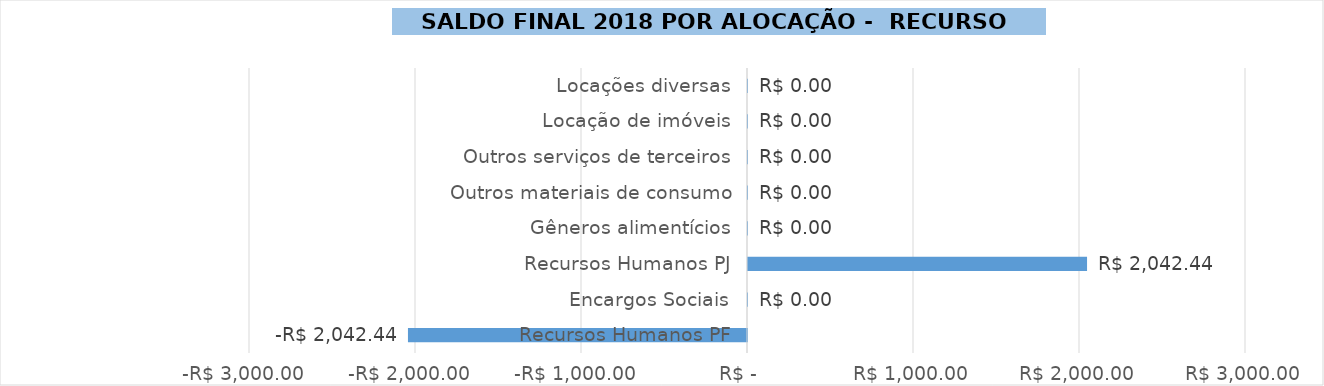
| Category | Saldo Final 2018 |
|---|---|
| Recursos Humanos PF | -2042.441 |
| Encargos Sociais | 0 |
| Recursos Humanos PJ | 2042.441 |
| Gêneros alimentícios | 0 |
| Outros materiais de consumo | 0 |
| Outros serviços de terceiros | 0 |
| Locação de imóveis | 0 |
| Locações diversas | 0 |